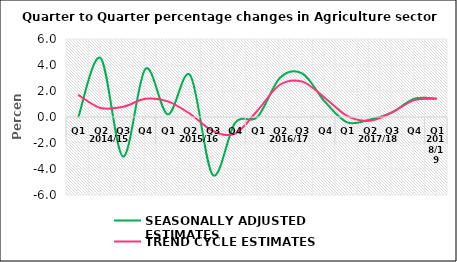
| Category | SEASONALLY ADJUSTED ESTIMATES | TREND CYCLE ESTIMATES |
|---|---|---|
| 0 | -0.035 | 1.705 |
| 1 | 4.53 | 0.688 |
| 2 | -3.044 | 0.779 |
| 3 | 3.702 | 1.395 |
| 4 | 0.205 | 1.204 |
| 5 | 3.203 | 0.23 |
| 6 | -4.445 | -1.066 |
| 7 | -0.456 | -1.275 |
| 8 | 0.011 | 0.503 |
| 9 | 3.009 | 2.481 |
| 10 | 3.347 | 2.723 |
| 11 | 1.189 | 1.482 |
| 12 | -0.411 | 0.082 |
| 13 | -0.206 | -0.296 |
| 14 | 0.356 | 0.352 |
| 15 | 1.406 | 1.295 |
| 16 | 1.413 | 1.414 |